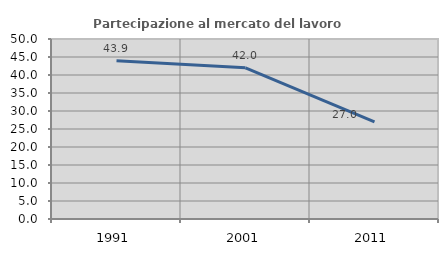
| Category | Partecipazione al mercato del lavoro  femminile |
|---|---|
| 1991.0 | 43.939 |
| 2001.0 | 41.985 |
| 2011.0 | 26.97 |